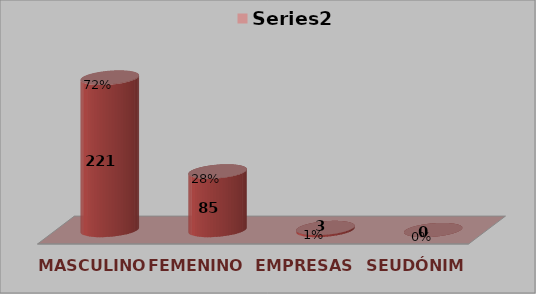
| Category | SOLICITUD POR GÉNERO | Series 1 |
|---|---|---|
| MASCULINO | 221 | 0.715 |
| FEMENINO | 85 | 0.275 |
| EMPRESAS | 3 | 0.01 |
| SEUDÓNIMO | 0 | 0 |